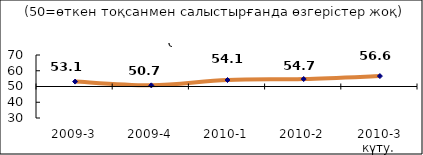
| Category | Диф.индекс ↓ |
|---|---|
| 2009-3 | 53.125 |
| 2009-4 | 50.73 |
| 2010-1 | 54.12 |
| 2010-2 | 54.73 |
| 2010-3 күту. | 56.61 |